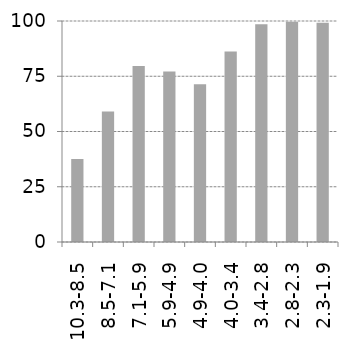
| Category | 30. 7 |
|---|---|
| 10.3-8.5 | 37.6 |
| 8.5-7.1 | 59 |
| 7.1-5.9 | 79.6 |
| 5.9-4.9 | 77.2 |
| 4.9-4.0 | 71.4 |
| 4.0-3.4 | 86.2 |
| 3.4-2.8 | 98.5 |
| 2.8-2.3 | 99.7 |
| 2.3-1.9 | 99.2 |